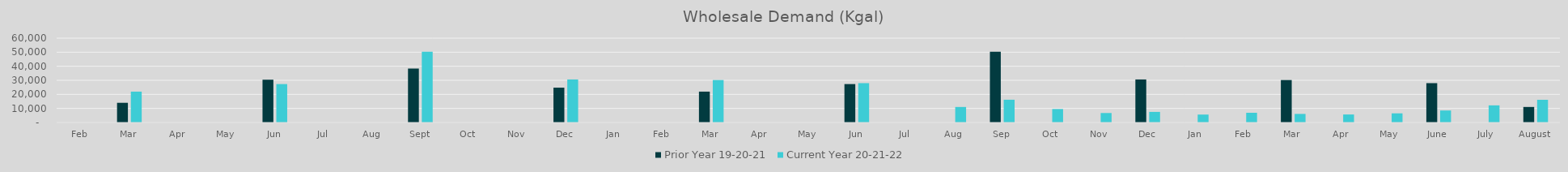
| Category | Prior Year 19-20-21 | Current Year 20-21-22 |
|---|---|---|
| Feb | 0 | 0 |
| Mar | 14013.78 | 21965.02 |
| Apr | 0 | 0 |
| May | 0 | 0 |
| Jun | 30443.6 | 27331 |
| Jul | 0 | 0 |
| Aug | 0 | 0 |
| Sep | 38376.14 | 50400.24 |
| Oct | 0 | 0 |
| Nov | 0 | 0 |
| Dec | 24784.98 | 30611.9 |
| Jan | 0 | 0 |
| Feb | 0 | 0 |
| Mar | 21965.02 | 30196.76 |
| Apr | 0 | 0 |
| May | 0 | 0 |
| Jun | 27331 | 27993.9 |
| Jul | 0 | 0 |
| Aug | 0 | 11056.179 |
| Sep | 50400.24 | 16202.763 |
| Oct | 0 | 9585.62 |
| Nov | 0 | 6754.44 |
| Dec | 30611.9 | 7547.32 |
| Jan | 0 | 5643.66 |
| Feb | 0 | 6907.78 |
| Mar | 30196.76 | 6111.16 |
| Apr | 0 | 5707.24 |
| May | 0 | 6522.56 |
| June | 27993.9 | 8549.64 |
| July | 0 | 12192.4 |
| August | 11056.179 | 16164.28 |